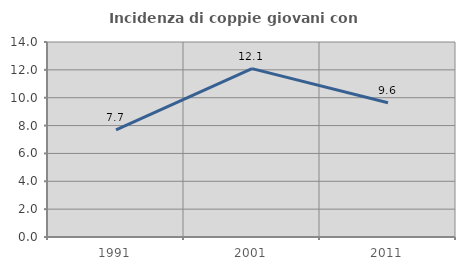
| Category | Incidenza di coppie giovani con figli |
|---|---|
| 1991.0 | 7.692 |
| 2001.0 | 12.088 |
| 2011.0 | 9.639 |